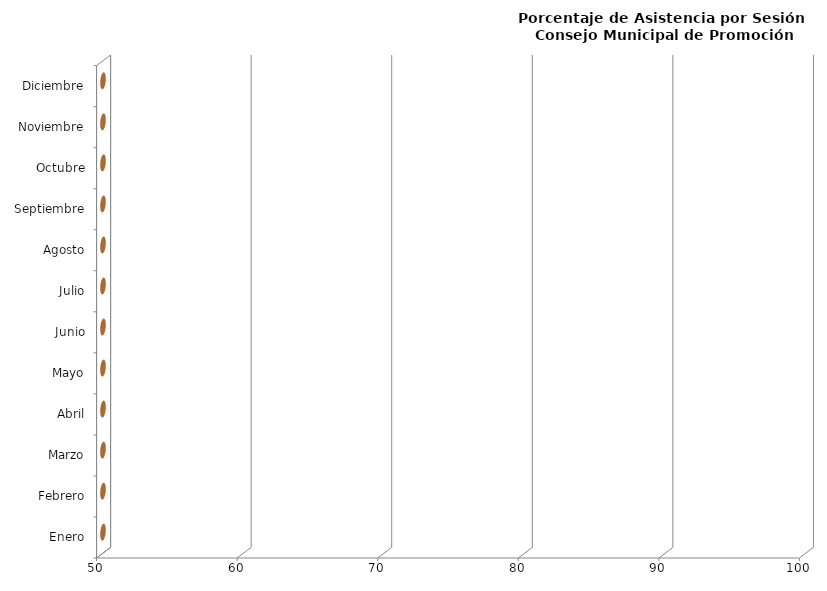
| Category | Series 0 |
|---|---|
| Enero | 0 |
| Febrero | 0 |
| Marzo | 0 |
| Abril | 0 |
| Mayo | 0 |
| Junio | 0 |
| Julio | 0 |
| Agosto | 0 |
| Septiembre | 0 |
| Octubre | 0 |
| Noviembre | 0 |
| Diciembre | 0 |